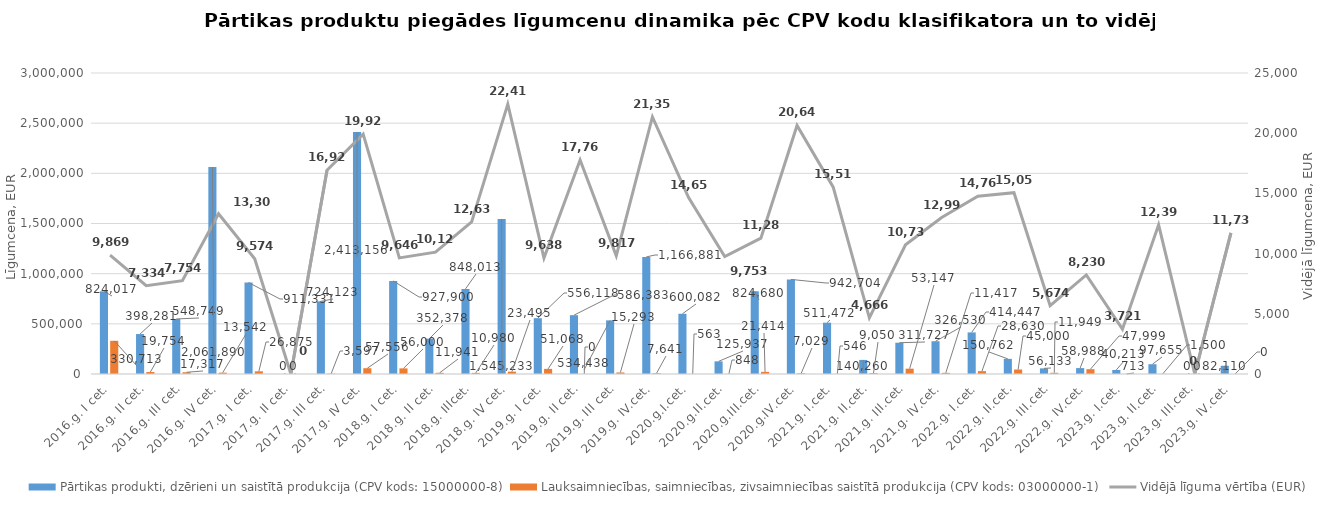
| Category | Pārtikas produkti, dzērieni un saistītā produkcija (CPV kods: 15000000-8) | Lauksaimniecības, saimniecības, zivsaimniecības saistītā produkcija (CPV kods: 03000000-1) |
|---|---|---|
| 2016.g. I cet. | 824017 | 330713 |
| 2016.g. II cet. | 398281 | 19754 |
| 2016.g. III cet. | 548749.01 | 17317 |
| 2016.g. IV cet. | 2061890 | 13542 |
| 2017.g. I cet. | 911330.81 | 26874.91 |
| 2017.g. II cet. | 0 | 0 |
| 2017.g. III cet. | 724123.07 | 3596.6 |
| 2017.g. IV cet. | 2413156 | 57556 |
| 2018.g. I cet. | 927900 | 56000 |
| 2018.g. II cet. | 352378 | 11941 |
| 2018.g. IIIcet. | 848013 | 10980 |
| 2018.g. IV cet. | 1545233 | 23495 |
| 2019.g. I cet. | 556118 | 51068 |
| 2019.g. II cet. | 586383 | 0 |
| 2019.g. III cet. | 534438 | 15293 |
| 2019.g. IV.cet. | 1166881 | 7641 |
| 2020.g.I.cet. | 600082 | 563 |
| 2020.g.II.cet. | 125937 | 848 |
| 2020.g.III.cet. | 824680 | 21414 |
| 2020.g.IV.cet. | 942704 | 7029 |
| 2021.g. I.cet. | 511472 | 546 |
| 2021.g. II.cet. | 140260 | 9050 |
| 2021.g. III.cet. | 311727 | 53147 |
| 2021.g. IV.cet. | 326530 | 11417 |
| 2022.g. I.cet. | 414447 | 28630 |
| 2022.g. II.cet. | 150762 | 45000 |
| 2022.g. III.cet. | 56133 | 11949 |
| 2022.g. IV.cet. | 58988 | 47999 |
| 2023.g. I.cet. | 40213 | 713 |
| 2023.g. II.cet. | 97655 | 1500 |
| 2023.g. III.cet. | 0 | 0 |
| 2023.g. IV.cet. | 82110 | 0 |